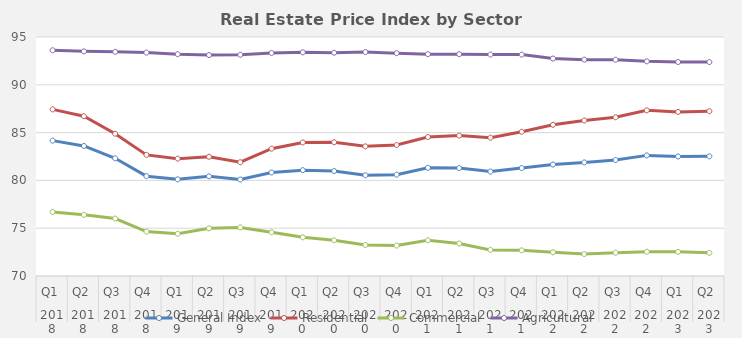
| Category | General Index | Residential | Commercial | Agricultural |
|---|---|---|---|---|
| 0 | 84.16 | 87.43 | 76.7 | 93.61 |
| 1 | 83.603 | 86.713 | 76.403 | 93.5 |
| 2 | 82.31 | 84.883 | 76.01 | 93.45 |
| 3 | 80.443 | 82.67 | 74.65 | 93.37 |
| 4 | 80.11 | 82.277 | 74.417 | 93.203 |
| 5 | 80.427 | 82.473 | 74.983 | 93.11 |
| 6 | 80.093 | 81.9 | 75.083 | 93.14 |
| 7 | 80.833 | 83.32 | 74.577 | 93.33 |
| 8 | 81.07 | 83.973 | 74.047 | 93.397 |
| 9 | 80.977 | 83.99 | 73.74 | 93.353 |
| 10 | 80.538 | 83.562 | 73.242 | 93.424 |
| 11 | 80.6 | 83.696 | 73.187 | 93.307 |
| 12 | 81.315 | 84.54 | 73.736 | 93.206 |
| 13 | 81.291 | 84.687 | 73.398 | 93.204 |
| 14 | 80.925 | 84.473 | 72.728 | 93.164 |
| 15 | 81.295 | 85.089 | 72.682 | 93.157 |
| 16 | 81.662 | 85.816 | 72.474 | 92.745 |
| 17 | 81.879 | 86.272 | 72.295 | 92.633 |
| 18 | 82.132 | 86.603 | 72.433 | 92.625 |
| 19 | 82.616 | 87.33 | 72.541 | 92.453 |
| 20 | 82.506 | 87.165 | 72.527 | 92.384 |
| 21 | 82.516 | 87.24 | 72.425 | 92.376 |